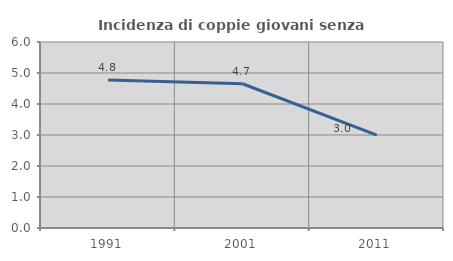
| Category | Incidenza di coppie giovani senza figli |
|---|---|
| 1991.0 | 4.775 |
| 2001.0 | 4.653 |
| 2011.0 | 2.999 |